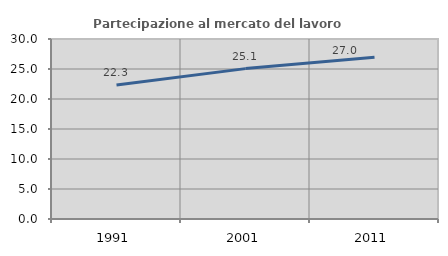
| Category | Partecipazione al mercato del lavoro  femminile |
|---|---|
| 1991.0 | 22.332 |
| 2001.0 | 25.064 |
| 2011.0 | 26.951 |